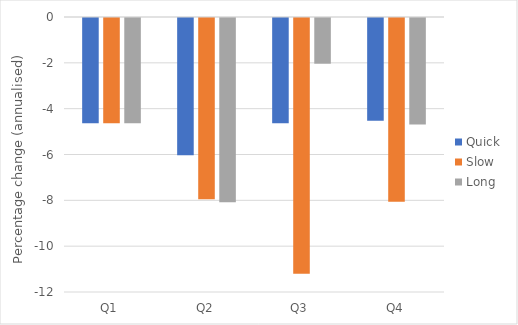
| Category | Quick | Slow | Long |
|---|---|---|---|
| Q1 | -4.593 | -4.593 | -4.593 |
| Q2 | -5.991 | -7.909 | -8.038 |
| Q3 | -4.597 | -11.157 | -1.994 |
| Q4 | -4.487 | -8.016 | -4.652 |